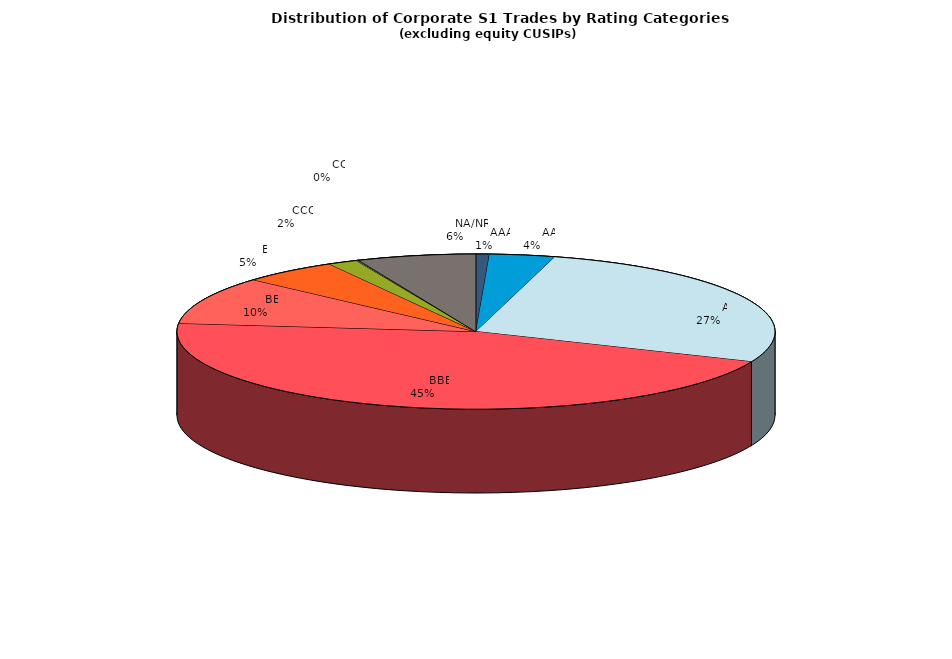
| Category | Series 0 |
|---|---|
|         AAA | 797.076 |
|         AA | 3905.484 |
|         A | 29928.928 |
|         BBB | 50085.012 |
|         BB | 10964.664 |
|         B | 5740.464 |
|         CCC | 1770.992 |
|         CC | 100.968 |
|         C | 31.956 |
|         D | 42.412 |
|         NA/NR | 7070.236 |